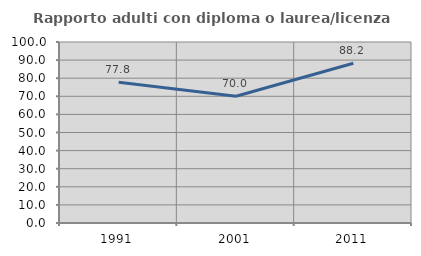
| Category | Rapporto adulti con diploma o laurea/licenza media  |
|---|---|
| 1991.0 | 77.778 |
| 2001.0 | 70 |
| 2011.0 | 88.235 |